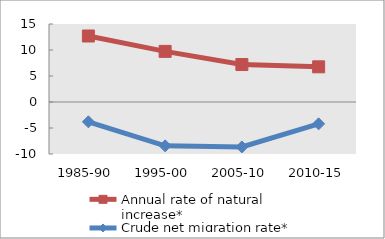
| Category | Annual rate of natural increase* | Crude net migration rate* |
|---|---|---|
| 1985-90 | 12.692 | -3.816 |
| 1995-00 | 9.737 | -8.433 |
| 2005-10 | 7.207 | -8.641 |
| 2010-15 | 6.765 | -4.203 |